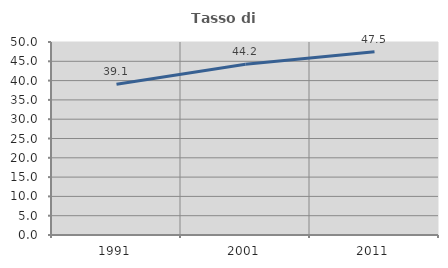
| Category | Tasso di occupazione   |
|---|---|
| 1991.0 | 39.059 |
| 2001.0 | 44.228 |
| 2011.0 | 47.498 |